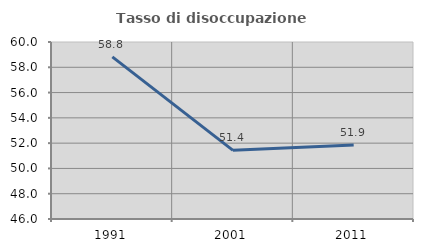
| Category | Tasso di disoccupazione giovanile  |
|---|---|
| 1991.0 | 58.824 |
| 2001.0 | 51.429 |
| 2011.0 | 51.852 |